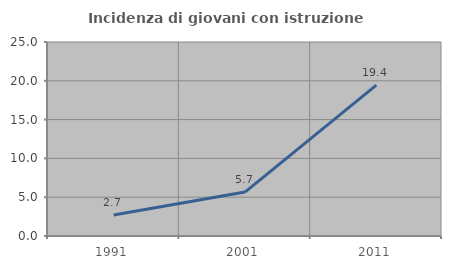
| Category | Incidenza di giovani con istruzione universitaria |
|---|---|
| 1991.0 | 2.703 |
| 2001.0 | 5.66 |
| 2011.0 | 19.444 |